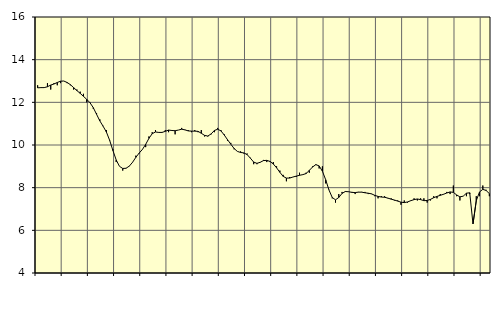
| Category | Piggar | Tillverkning av verkstadsvaror, SNI 25-30, 331 |
|---|---|---|
| nan | 12.8 | 12.68 |
| 87.0 | 12.7 | 12.69 |
| 87.0 | 12.7 | 12.69 |
| 87.0 | 12.9 | 12.73 |
| nan | 12.6 | 12.81 |
| 88.0 | 12.9 | 12.86 |
| 88.0 | 12.8 | 12.93 |
| 88.0 | 12.9 | 12.99 |
| nan | 13 | 13 |
| 89.0 | 12.9 | 12.93 |
| 89.0 | 12.8 | 12.83 |
| 89.0 | 12.6 | 12.69 |
| nan | 12.6 | 12.55 |
| 90.0 | 12.5 | 12.42 |
| 90.0 | 12.4 | 12.28 |
| 90.0 | 12 | 12.14 |
| nan | 12 | 11.98 |
| 91.0 | 11.7 | 11.75 |
| 91.0 | 11.5 | 11.44 |
| 91.0 | 11.2 | 11.13 |
| nan | 10.9 | 10.88 |
| 92.0 | 10.7 | 10.61 |
| 92.0 | 10.2 | 10.22 |
| 92.0 | 9.8 | 9.74 |
| nan | 9.2 | 9.3 |
| 93.0 | 9 | 9 |
| 93.0 | 8.8 | 8.9 |
| 93.0 | 8.9 | 8.91 |
| nan | 9 | 9.01 |
| 94.0 | 9.2 | 9.19 |
| 94.0 | 9.5 | 9.42 |
| 94.0 | 9.6 | 9.62 |
| nan | 9.8 | 9.79 |
| 95.0 | 9.9 | 10.03 |
| 95.0 | 10.4 | 10.31 |
| 95.0 | 10.6 | 10.53 |
| nan | 10.7 | 10.61 |
| 96.0 | 10.6 | 10.59 |
| 96.0 | 10.6 | 10.59 |
| 96.0 | 10.7 | 10.64 |
| nan | 10.6 | 10.7 |
| 97.0 | 10.7 | 10.68 |
| 97.0 | 10.5 | 10.67 |
| 97.0 | 10.7 | 10.7 |
| nan | 10.8 | 10.74 |
| 98.0 | 10.7 | 10.71 |
| 98.0 | 10.7 | 10.66 |
| 98.0 | 10.6 | 10.65 |
| nan | 10.7 | 10.65 |
| 99.0 | 10.6 | 10.64 |
| 99.0 | 10.7 | 10.55 |
| 99.0 | 10.4 | 10.45 |
| nan | 10.4 | 10.42 |
| 0.0 | 10.5 | 10.52 |
| 0.0 | 10.6 | 10.68 |
| 0.0 | 10.8 | 10.74 |
| nan | 10.7 | 10.66 |
| 1.0 | 10.5 | 10.47 |
| 1.0 | 10.2 | 10.25 |
| 1.0 | 10.1 | 10.04 |
| nan | 9.8 | 9.84 |
| 2.0 | 9.7 | 9.7 |
| 2.0 | 9.7 | 9.65 |
| 2.0 | 9.6 | 9.63 |
| nan | 9.6 | 9.55 |
| 3.0 | 9.4 | 9.38 |
| 3.0 | 9.1 | 9.2 |
| 3.0 | 9.1 | 9.14 |
| nan | 9.2 | 9.19 |
| 4.0 | 9.3 | 9.27 |
| 4.0 | 9.2 | 9.28 |
| 4.0 | 9.2 | 9.23 |
| nan | 9.2 | 9.11 |
| 5.0 | 9 | 8.93 |
| 5.0 | 8.8 | 8.72 |
| 5.0 | 8.6 | 8.53 |
| nan | 8.3 | 8.45 |
| 6.0 | 8.5 | 8.45 |
| 6.0 | 8.5 | 8.5 |
| 6.0 | 8.5 | 8.54 |
| nan | 8.7 | 8.58 |
| 7.0 | 8.6 | 8.61 |
| 7.0 | 8.7 | 8.66 |
| 7.0 | 8.7 | 8.81 |
| nan | 9 | 8.97 |
| 8.0 | 9.1 | 9.08 |
| 8.0 | 8.9 | 9.02 |
| 8.0 | 9 | 8.77 |
| nan | 8.2 | 8.37 |
| 9.0 | 7.9 | 7.89 |
| 9.0 | 7.5 | 7.54 |
| 9.0 | 7.3 | 7.43 |
| nan | 7.7 | 7.54 |
| 10.0 | 7.8 | 7.73 |
| 10.0 | 7.8 | 7.82 |
| 10.0 | 7.8 | 7.81 |
| nan | 7.8 | 7.78 |
| 11.0 | 7.7 | 7.77 |
| 11.0 | 7.8 | 7.79 |
| 11.0 | 7.8 | 7.79 |
| nan | 7.8 | 7.76 |
| 12.0 | 7.7 | 7.74 |
| 12.0 | 7.7 | 7.71 |
| 12.0 | 7.6 | 7.64 |
| nan | 7.5 | 7.59 |
| 13.0 | 7.6 | 7.56 |
| 13.0 | 7.6 | 7.55 |
| 13.0 | 7.5 | 7.51 |
| nan | 7.5 | 7.46 |
| 14.0 | 7.4 | 7.42 |
| 14.0 | 7.4 | 7.37 |
| 14.0 | 7.2 | 7.32 |
| nan | 7.4 | 7.3 |
| 15.0 | 7.3 | 7.33 |
| 15.0 | 7.4 | 7.39 |
| 15.0 | 7.5 | 7.44 |
| nan | 7.4 | 7.47 |
| 16.0 | 7.5 | 7.44 |
| 16.0 | 7.5 | 7.39 |
| 16.0 | 7.3 | 7.4 |
| nan | 7.4 | 7.45 |
| 17.0 | 7.6 | 7.53 |
| 17.0 | 7.5 | 7.59 |
| 17.0 | 7.7 | 7.64 |
| nan | 7.7 | 7.69 |
| 18.0 | 7.8 | 7.75 |
| 18.0 | 7.7 | 7.8 |
| 18.0 | 8.1 | 7.78 |
| nan | 7.6 | 7.66 |
| 19.0 | 7.4 | 7.57 |
| 19.0 | 7.6 | 7.6 |
| 19.0 | 7.6 | 7.74 |
| nan | 7.7 | 7.76 |
| 20.0 | 6.3 | 6.3 |
| 20.0 | 7.6 | 7.39 |
| 20.0 | 7.6 | 7.8 |
| nan | 8.1 | 7.92 |
| 21.0 | 7.9 | 7.87 |
| 21.0 | 7.6 | 7.72 |